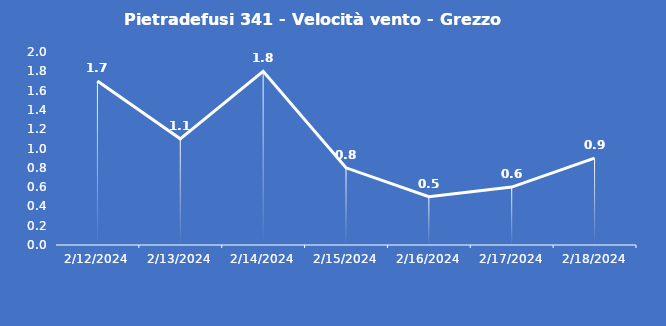
| Category | Pietradefusi 341 - Velocità vento - Grezzo (m/s) |
|---|---|
| 2/12/24 | 1.7 |
| 2/13/24 | 1.1 |
| 2/14/24 | 1.8 |
| 2/15/24 | 0.8 |
| 2/16/24 | 0.5 |
| 2/17/24 | 0.6 |
| 2/18/24 | 0.9 |